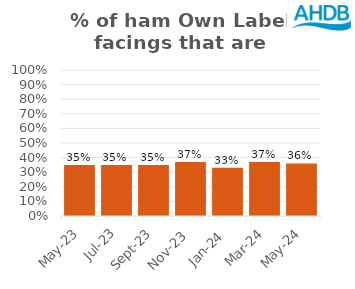
| Category | Ham |
|---|---|
| 2023-05-01 | 0.35 |
| 2023-07-01 | 0.35 |
| 2023-09-01 | 0.35 |
| 2023-11-01 | 0.37 |
| 2024-01-01 | 0.33 |
| 2024-03-01 | 0.37 |
| 2024-05-01 | 0.36 |